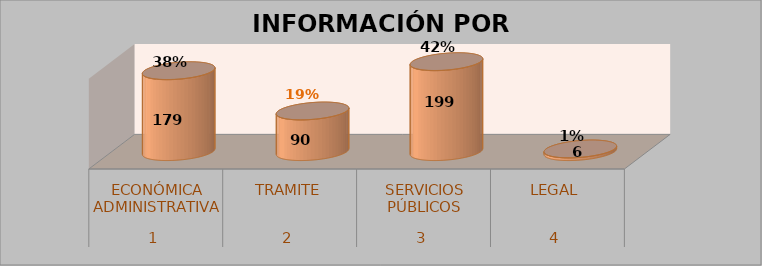
| Category | Series 0 | Series 1 | Series 2 | Series 3 |
|---|---|---|---|---|
| 0 |  |  | 179 | 0.378 |
| 1 |  |  | 90 | 0.19 |
| 2 |  |  | 199 | 0.42 |
| 3 |  |  | 6 | 0.013 |